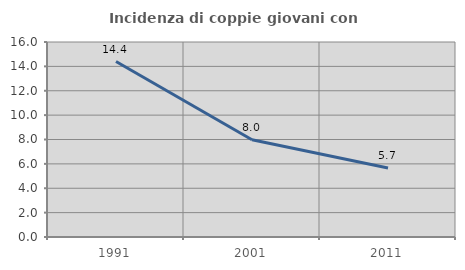
| Category | Incidenza di coppie giovani con figli |
|---|---|
| 1991.0 | 14.399 |
| 2001.0 | 7.982 |
| 2011.0 | 5.658 |